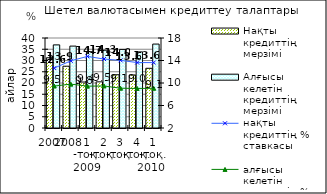
| Category | Нақты кредиттің мерзімі  | Алғысы келетін кредиттің мерзімі |
|---|---|---|
| 2007 | 31.21 | 36.94 |
| 2008 | 27.465 | 36.4 |
| 1 -тоқ. 2009 | 20.43 | 33.91 |
| 2 -тоқ.  | 20.51 | 34.57 |
| 3 -тоқ. | 23.67 | 34.93 |
| 4 -тоқ. | 23.57 | 33.82 |
| 1 -тоқ. 2010  | 26.54 | 37.3 |